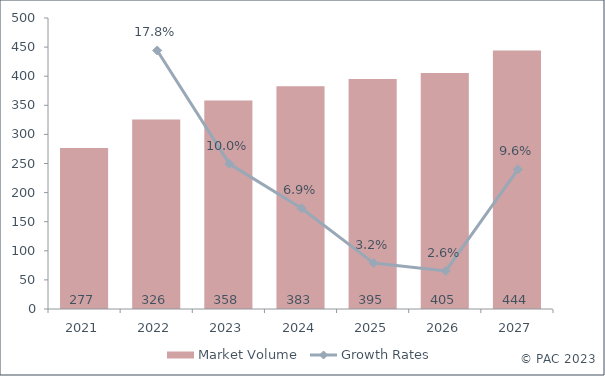
| Category | Market Volume |
|---|---|
| 2021.0 | 276.522 |
| 2022.0 | 325.657 |
| 2023.0 | 358.149 |
| 2024.0 | 382.928 |
| 2025.0 | 395.008 |
| 2026.0 | 405.36 |
| 2027.0 | 444.284 |